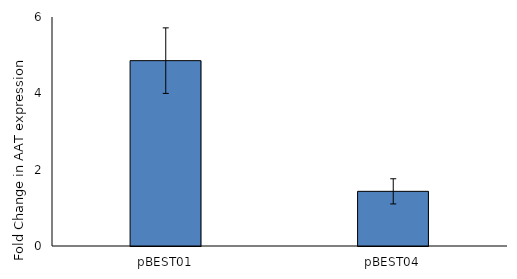
| Category | Series 0 |
|---|---|
| pBEST01 | 4.856 |
| pBEST04 | 1.432 |